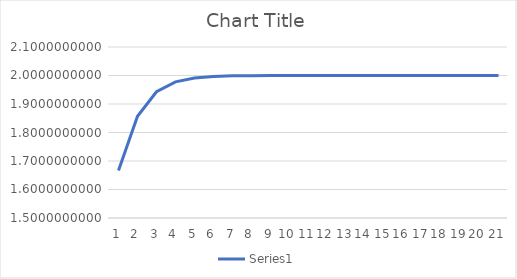
| Category | Series 0 |
|---|---|
| 0 | 1.667 |
| 1 | 1.857 |
| 2 | 1.943 |
| 3 | 1.978 |
| 4 | 1.991 |
| 5 | 1.997 |
| 6 | 1.999 |
| 7 | 2 |
| 8 | 2 |
| 9 | 2 |
| 10 | 2 |
| 11 | 2 |
| 12 | 2 |
| 13 | 2 |
| 14 | 2 |
| 15 | 2 |
| 16 | 2 |
| 17 | 2 |
| 18 | 2 |
| 19 | 2 |
| 20 | 2 |